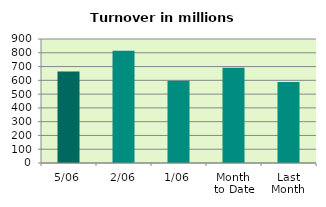
| Category | Series 0 |
|---|---|
| 5/06 | 663.3 |
| 2/06 | 814.528 |
| 1/06 | 597.468 |
| Month 
to Date | 691.766 |
| Last
Month | 587.249 |